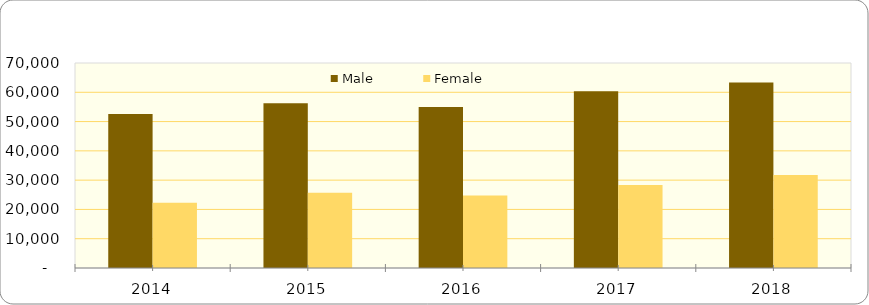
| Category | Male | Female |
|---|---|---|
| 2014.0 | 52562 | 22287 |
| 2015.0 | 56251 | 25671 |
| 2016.0 | 54979 | 24750 |
| 2017.0 | 60340 | 28376 |
| 2018.0 | 63354 | 31733 |